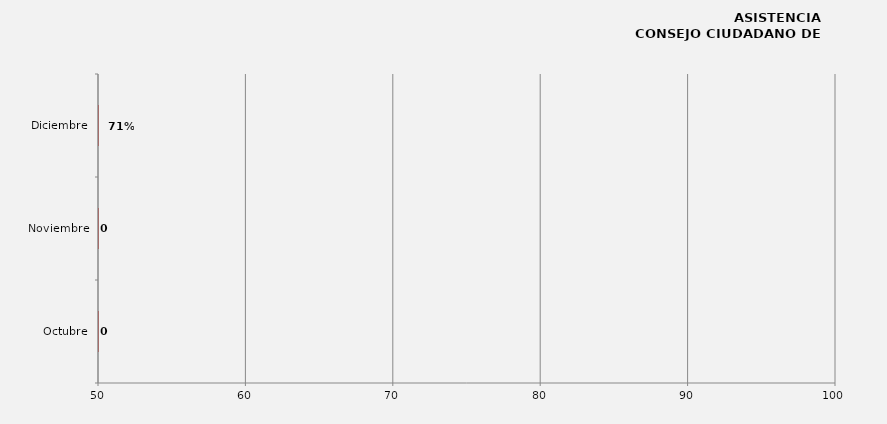
| Category | Series 1 |
|---|---|
| Octubre | 0 |
| Noviembre | 0 |
| Diciembre | 0 |